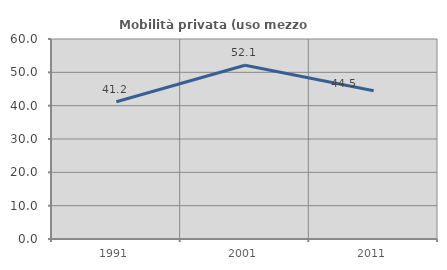
| Category | Mobilità privata (uso mezzo privato) |
|---|---|
| 1991.0 | 41.158 |
| 2001.0 | 52.124 |
| 2011.0 | 44.493 |